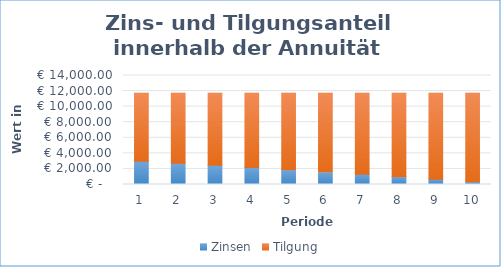
| Category | Zinsen | Tilgung |
|---|---|---|
| 0 | 3000 | 8723.051 |
| 1 | 2738.308 | 8984.742 |
| 2 | 2468.766 | 9254.284 |
| 3 | 2191.138 | 9531.913 |
| 4 | 1905.18 | 9817.87 |
| 5 | 1610.644 | 10112.406 |
| 6 | 1307.272 | 10415.779 |
| 7 | 994.799 | 10728.252 |
| 8 | 672.951 | 11050.1 |
| 9 | 341.448 | 11381.603 |